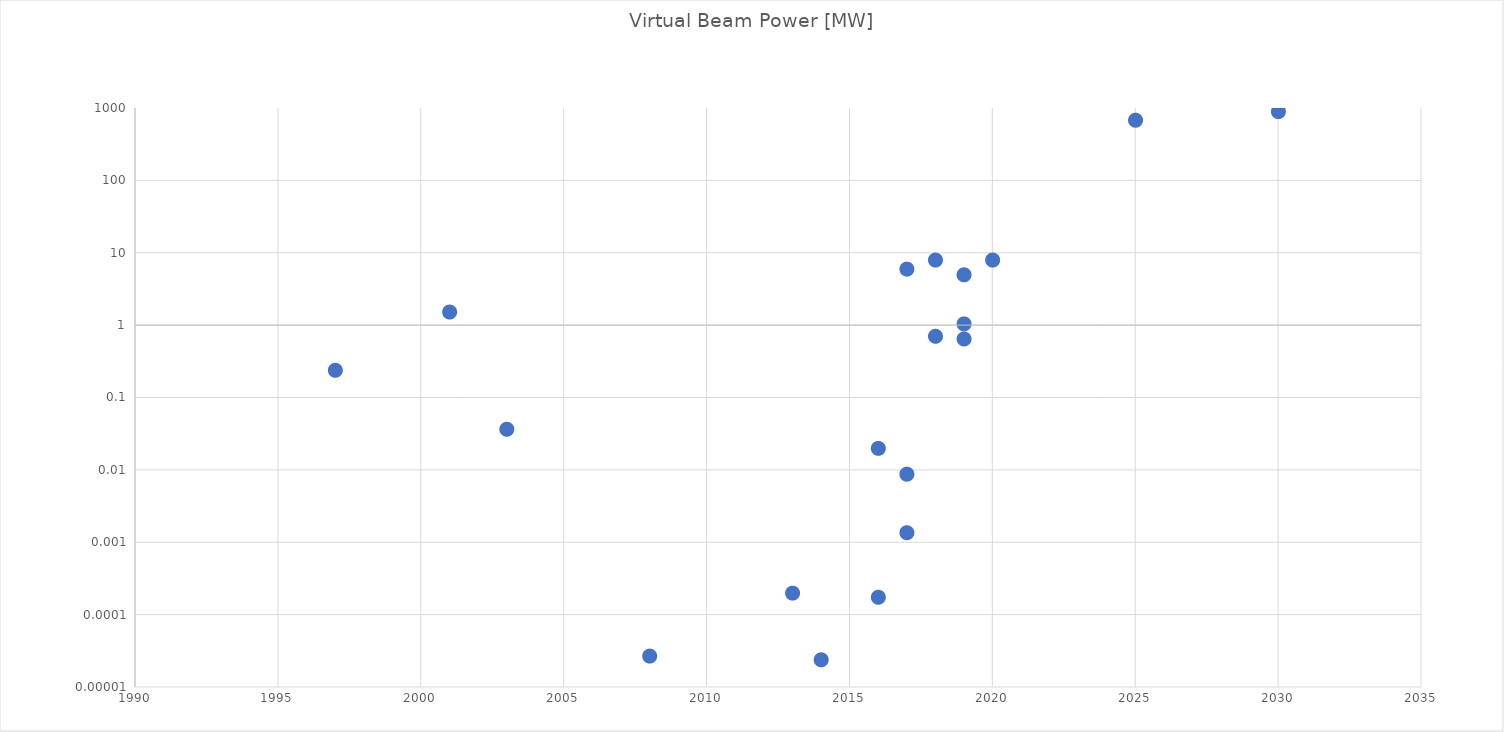
| Category | Virtual Beam Power |
|---|---|
| 2003.0 | 0.037 |
| 1997.0 | 0.24 |
| 2001.0 | 1.53 |
| 2018.0 | 0.708 |
| 2013.0 | 0 |
| 2016.0 | 0.02 |
| 2018.0 | 8 |
| 2008.0 | 0 |
| 2016.0 | 0 |
| 2019.0 | 5 |
| 2017.0 | 6 |
| 2017.0 | 0.001 |
| 2019.0 | 1.05 |
| 2014.0 | 0 |
| 2025.0 | 684 |
| 2017.0 | 0.009 |
| 2030.0 | 900 |
| 2020.0 | 8 |
| 2019.0 | 0.65 |